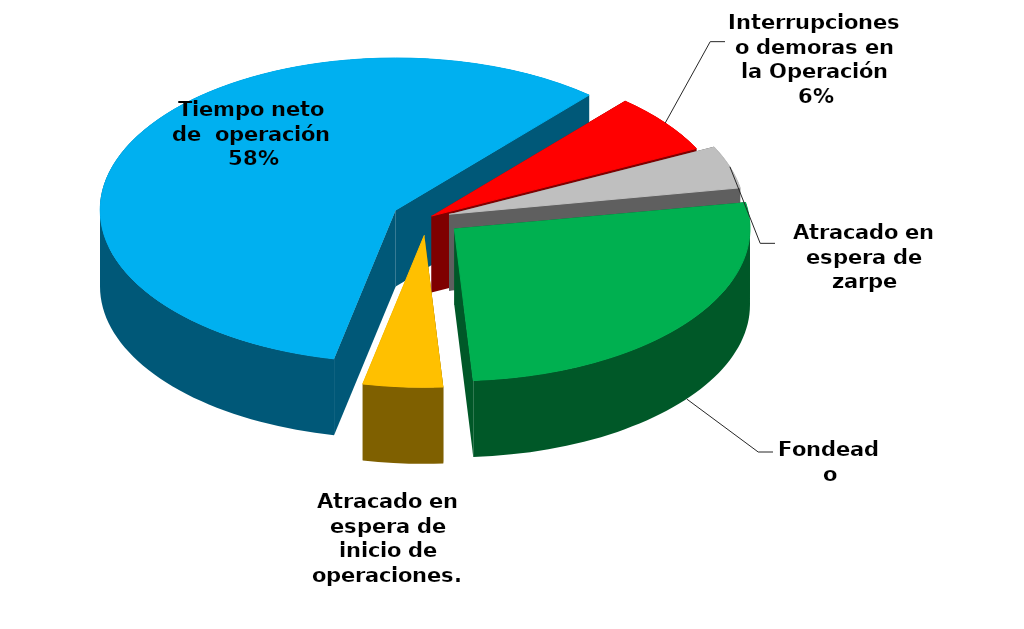
| Category | Series 0 |
|---|---|
| Fondeado | 25167.404 |
| Atracado en espera de inicio de operaciones. | 4103.77 |
| Tiempo neto de  operación | 54564.644 |
| Interrupciones o demoras en la Operación | 5948.31 |
| Atracado en espera de zarpe | 4278.166 |